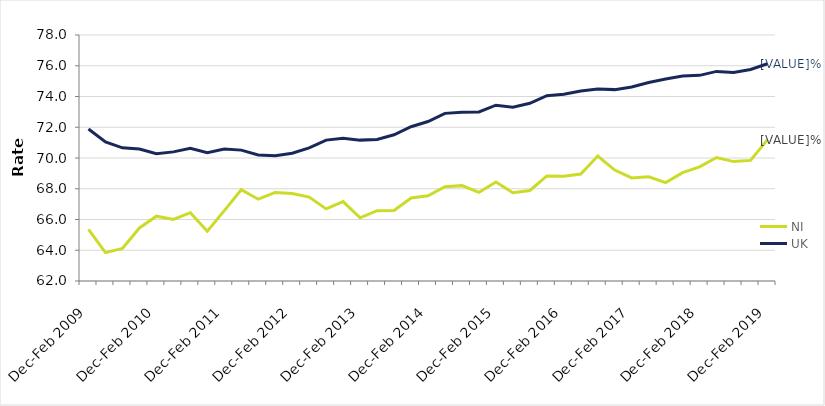
| Category | NI | UK |
|---|---|---|
| Dec-Feb 2009 | 65.352 | 71.882 |
| Mar-May 2009 | 63.847 | 71.049 |
| Jun-Aug 2009 | 64.122 | 70.661 |
| Sep-Nov 2009 | 65.451 | 70.579 |
| Dec-Feb 2010 | 66.217 | 70.28 |
| Mar-May 2010 | 66.009 | 70.398 |
| Jun-Aug 2010 | 66.442 | 70.639 |
| Sep-Nov 2010 | 65.232 | 70.339 |
| Dec-Feb 2011 | 66.574 | 70.586 |
| Mar-May 2011 | 67.937 | 70.512 |
| Jun-Aug 2011 | 67.32 | 70.195 |
| Sep-Nov 2011 | 67.762 | 70.145 |
| Dec-Feb 2012 | 67.69 | 70.313 |
| Mar-May 2012 | 67.458 | 70.66 |
| Jun-Aug 2012 | 66.691 | 71.164 |
| Sep-Nov 2012 | 67.167 | 71.29 |
| Dec-Feb 2013 | 66.112 | 71.163 |
| Mar-May 2013 | 66.574 | 71.205 |
| Jun-Aug 2013 | 66.587 | 71.509 |
| Sep-Nov 2013 | 67.397 | 72.034 |
| Dec-Feb 2014 | 67.54 | 72.373 |
| Mar-May 2014 | 68.133 | 72.903 |
| Jun-Aug 2014 | 68.203 | 72.974 |
| Sep-Nov 2014 | 67.762 | 72.993 |
| Dec-Feb 2015 | 68.44 | 73.433 |
| Mar-May 2015 | 67.744 | 73.309 |
| Jun-Aug 2015 | 67.887 | 73.559 |
| Sep-Nov 2015 | 68.833 | 74.049 |
| Dec-Feb 2016 | 68.816 | 74.14 |
| Mar-May 2016 | 68.959 | 74.357 |
| Jun-Aug 2016 | 70.127 | 74.486 |
| Sep-Nov 2016 | 69.214 | 74.447 |
| Dec-Feb 2017 | 68.706 | 74.624 |
| Mar-May 2017 | 68.774 | 74.909 |
| Jun-Aug 2017 | 68.402 | 75.138 |
| Sep-Nov 2017 | 69.045 | 75.338 |
| Dec-Feb 2018 | 69.419 | 75.375 |
| Mar-May 2018 | 70.029 | 75.632 |
| Jun-Aug 2018 | 69.765 | 75.557 |
| Sep-Nov 2018 | 69.845 | 75.761 |
| Dec-Feb 2019 | 71.196 | 76.127 |